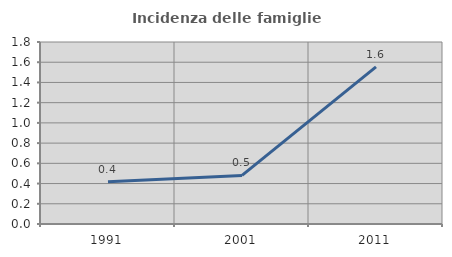
| Category | Incidenza delle famiglie numerose |
|---|---|
| 1991.0 | 0.418 |
| 2001.0 | 0.481 |
| 2011.0 | 1.554 |